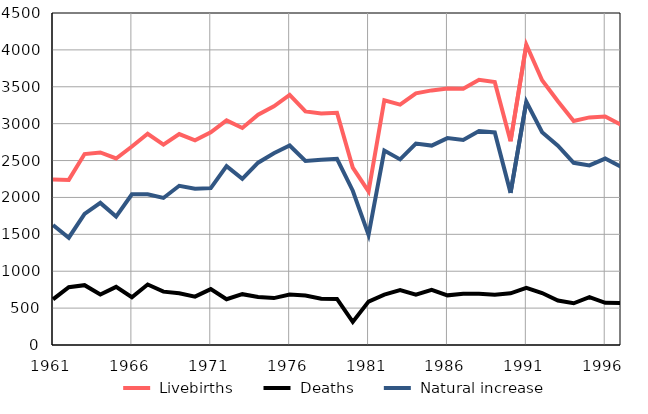
| Category |  Livebirths |  Deaths |  Natural increase |
|---|---|---|---|
| 1961.0 | 2244 | 619 | 1625 |
| 1962.0 | 2238 | 784 | 1454 |
| 1963.0 | 2588 | 811 | 1777 |
| 1964.0 | 2610 | 684 | 1926 |
| 1965.0 | 2528 | 788 | 1740 |
| 1966.0 | 2690 | 648 | 2042 |
| 1967.0 | 2863 | 820 | 2043 |
| 1968.0 | 2716 | 723 | 1993 |
| 1969.0 | 2859 | 701 | 2158 |
| 1970.0 | 2774 | 656 | 2118 |
| 1971.0 | 2884 | 758 | 2126 |
| 1972.0 | 3045 | 620 | 2425 |
| 1973.0 | 2942 | 689 | 2253 |
| 1974.0 | 3121 | 650 | 2471 |
| 1975.0 | 3236 | 636 | 2600 |
| 1976.0 | 3389 | 685 | 2704 |
| 1977.0 | 3166 | 671 | 2495 |
| 1978.0 | 3137 | 627 | 2510 |
| 1979.0 | 3147 | 625 | 2522 |
| 1980.0 | 2404 | 313 | 2091 |
| 1981.0 | 2082 | 589 | 1493 |
| 1982.0 | 3318 | 682 | 2636 |
| 1983.0 | 3259 | 743 | 2516 |
| 1984.0 | 3411 | 681 | 2730 |
| 1985.0 | 3451 | 748 | 2703 |
| 1986.0 | 3477 | 673 | 2804 |
| 1987.0 | 3472 | 693 | 2779 |
| 1988.0 | 3595 | 694 | 2901 |
| 1989.0 | 3563 | 682 | 2881 |
| 1990.0 | 2762 | 700 | 2062 |
| 1991.0 | 4071 | 774 | 3297 |
| 1992.0 | 3589 | 705 | 2884 |
| 1993.0 | 3304 | 602 | 2702 |
| 1994.0 | 3036 | 566 | 2470 |
| 1995.0 | 3085 | 650 | 2435 |
| 1996.0 | 3098 | 571 | 2527 |
| 1997.0 | 2985 | 570 | 2415 |